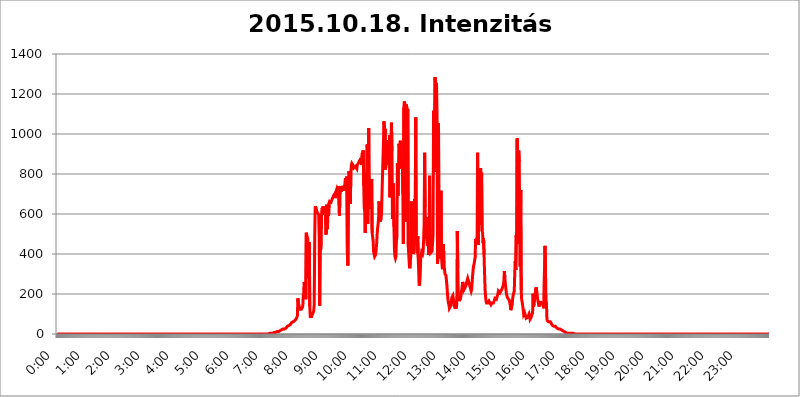
| Category | 2015.10.18. Intenzitás [W/m^2] |
|---|---|
| 0.0 | 0 |
| 0.0006944444444444445 | 0 |
| 0.001388888888888889 | 0 |
| 0.0020833333333333333 | 0 |
| 0.002777777777777778 | 0 |
| 0.003472222222222222 | 0 |
| 0.004166666666666667 | 0 |
| 0.004861111111111111 | 0 |
| 0.005555555555555556 | 0 |
| 0.0062499999999999995 | 0 |
| 0.006944444444444444 | 0 |
| 0.007638888888888889 | 0 |
| 0.008333333333333333 | 0 |
| 0.009027777777777779 | 0 |
| 0.009722222222222222 | 0 |
| 0.010416666666666666 | 0 |
| 0.011111111111111112 | 0 |
| 0.011805555555555555 | 0 |
| 0.012499999999999999 | 0 |
| 0.013194444444444444 | 0 |
| 0.013888888888888888 | 0 |
| 0.014583333333333332 | 0 |
| 0.015277777777777777 | 0 |
| 0.015972222222222224 | 0 |
| 0.016666666666666666 | 0 |
| 0.017361111111111112 | 0 |
| 0.018055555555555557 | 0 |
| 0.01875 | 0 |
| 0.019444444444444445 | 0 |
| 0.02013888888888889 | 0 |
| 0.020833333333333332 | 0 |
| 0.02152777777777778 | 0 |
| 0.022222222222222223 | 0 |
| 0.02291666666666667 | 0 |
| 0.02361111111111111 | 0 |
| 0.024305555555555556 | 0 |
| 0.024999999999999998 | 0 |
| 0.025694444444444447 | 0 |
| 0.02638888888888889 | 0 |
| 0.027083333333333334 | 0 |
| 0.027777777777777776 | 0 |
| 0.02847222222222222 | 0 |
| 0.029166666666666664 | 0 |
| 0.029861111111111113 | 0 |
| 0.030555555555555555 | 0 |
| 0.03125 | 0 |
| 0.03194444444444445 | 0 |
| 0.03263888888888889 | 0 |
| 0.03333333333333333 | 0 |
| 0.034027777777777775 | 0 |
| 0.034722222222222224 | 0 |
| 0.035416666666666666 | 0 |
| 0.036111111111111115 | 0 |
| 0.03680555555555556 | 0 |
| 0.0375 | 0 |
| 0.03819444444444444 | 0 |
| 0.03888888888888889 | 0 |
| 0.03958333333333333 | 0 |
| 0.04027777777777778 | 0 |
| 0.04097222222222222 | 0 |
| 0.041666666666666664 | 0 |
| 0.042361111111111106 | 0 |
| 0.04305555555555556 | 0 |
| 0.043750000000000004 | 0 |
| 0.044444444444444446 | 0 |
| 0.04513888888888889 | 0 |
| 0.04583333333333334 | 0 |
| 0.04652777777777778 | 0 |
| 0.04722222222222222 | 0 |
| 0.04791666666666666 | 0 |
| 0.04861111111111111 | 0 |
| 0.049305555555555554 | 0 |
| 0.049999999999999996 | 0 |
| 0.05069444444444445 | 0 |
| 0.051388888888888894 | 0 |
| 0.052083333333333336 | 0 |
| 0.05277777777777778 | 0 |
| 0.05347222222222222 | 0 |
| 0.05416666666666667 | 0 |
| 0.05486111111111111 | 0 |
| 0.05555555555555555 | 0 |
| 0.05625 | 0 |
| 0.05694444444444444 | 0 |
| 0.057638888888888885 | 0 |
| 0.05833333333333333 | 0 |
| 0.05902777777777778 | 0 |
| 0.059722222222222225 | 0 |
| 0.06041666666666667 | 0 |
| 0.061111111111111116 | 0 |
| 0.06180555555555556 | 0 |
| 0.0625 | 0 |
| 0.06319444444444444 | 0 |
| 0.06388888888888888 | 0 |
| 0.06458333333333334 | 0 |
| 0.06527777777777778 | 0 |
| 0.06597222222222222 | 0 |
| 0.06666666666666667 | 0 |
| 0.06736111111111111 | 0 |
| 0.06805555555555555 | 0 |
| 0.06874999999999999 | 0 |
| 0.06944444444444443 | 0 |
| 0.07013888888888889 | 0 |
| 0.07083333333333333 | 0 |
| 0.07152777777777779 | 0 |
| 0.07222222222222223 | 0 |
| 0.07291666666666667 | 0 |
| 0.07361111111111111 | 0 |
| 0.07430555555555556 | 0 |
| 0.075 | 0 |
| 0.07569444444444444 | 0 |
| 0.0763888888888889 | 0 |
| 0.07708333333333334 | 0 |
| 0.07777777777777778 | 0 |
| 0.07847222222222222 | 0 |
| 0.07916666666666666 | 0 |
| 0.0798611111111111 | 0 |
| 0.08055555555555556 | 0 |
| 0.08125 | 0 |
| 0.08194444444444444 | 0 |
| 0.08263888888888889 | 0 |
| 0.08333333333333333 | 0 |
| 0.08402777777777777 | 0 |
| 0.08472222222222221 | 0 |
| 0.08541666666666665 | 0 |
| 0.08611111111111112 | 0 |
| 0.08680555555555557 | 0 |
| 0.08750000000000001 | 0 |
| 0.08819444444444445 | 0 |
| 0.08888888888888889 | 0 |
| 0.08958333333333333 | 0 |
| 0.09027777777777778 | 0 |
| 0.09097222222222222 | 0 |
| 0.09166666666666667 | 0 |
| 0.09236111111111112 | 0 |
| 0.09305555555555556 | 0 |
| 0.09375 | 0 |
| 0.09444444444444444 | 0 |
| 0.09513888888888888 | 0 |
| 0.09583333333333333 | 0 |
| 0.09652777777777777 | 0 |
| 0.09722222222222222 | 0 |
| 0.09791666666666667 | 0 |
| 0.09861111111111111 | 0 |
| 0.09930555555555555 | 0 |
| 0.09999999999999999 | 0 |
| 0.10069444444444443 | 0 |
| 0.1013888888888889 | 0 |
| 0.10208333333333335 | 0 |
| 0.10277777777777779 | 0 |
| 0.10347222222222223 | 0 |
| 0.10416666666666667 | 0 |
| 0.10486111111111111 | 0 |
| 0.10555555555555556 | 0 |
| 0.10625 | 0 |
| 0.10694444444444444 | 0 |
| 0.1076388888888889 | 0 |
| 0.10833333333333334 | 0 |
| 0.10902777777777778 | 0 |
| 0.10972222222222222 | 0 |
| 0.1111111111111111 | 0 |
| 0.11180555555555556 | 0 |
| 0.11180555555555556 | 0 |
| 0.1125 | 0 |
| 0.11319444444444444 | 0 |
| 0.11388888888888889 | 0 |
| 0.11458333333333333 | 0 |
| 0.11527777777777777 | 0 |
| 0.11597222222222221 | 0 |
| 0.11666666666666665 | 0 |
| 0.1173611111111111 | 0 |
| 0.11805555555555557 | 0 |
| 0.11944444444444445 | 0 |
| 0.12013888888888889 | 0 |
| 0.12083333333333333 | 0 |
| 0.12152777777777778 | 0 |
| 0.12222222222222223 | 0 |
| 0.12291666666666667 | 0 |
| 0.12291666666666667 | 0 |
| 0.12361111111111112 | 0 |
| 0.12430555555555556 | 0 |
| 0.125 | 0 |
| 0.12569444444444444 | 0 |
| 0.12638888888888888 | 0 |
| 0.12708333333333333 | 0 |
| 0.16875 | 0 |
| 0.12847222222222224 | 0 |
| 0.12916666666666668 | 0 |
| 0.12986111111111112 | 0 |
| 0.13055555555555556 | 0 |
| 0.13125 | 0 |
| 0.13194444444444445 | 0 |
| 0.1326388888888889 | 0 |
| 0.13333333333333333 | 0 |
| 0.13402777777777777 | 0 |
| 0.13402777777777777 | 0 |
| 0.13472222222222222 | 0 |
| 0.13541666666666666 | 0 |
| 0.1361111111111111 | 0 |
| 0.13749999999999998 | 0 |
| 0.13819444444444443 | 0 |
| 0.1388888888888889 | 0 |
| 0.13958333333333334 | 0 |
| 0.14027777777777778 | 0 |
| 0.14097222222222222 | 0 |
| 0.14166666666666666 | 0 |
| 0.1423611111111111 | 0 |
| 0.14305555555555557 | 0 |
| 0.14375000000000002 | 0 |
| 0.14444444444444446 | 0 |
| 0.1451388888888889 | 0 |
| 0.1451388888888889 | 0 |
| 0.14652777777777778 | 0 |
| 0.14722222222222223 | 0 |
| 0.14791666666666667 | 0 |
| 0.1486111111111111 | 0 |
| 0.14930555555555555 | 0 |
| 0.15 | 0 |
| 0.15069444444444444 | 0 |
| 0.15138888888888888 | 0 |
| 0.15208333333333332 | 0 |
| 0.15277777777777776 | 0 |
| 0.15347222222222223 | 0 |
| 0.15416666666666667 | 0 |
| 0.15486111111111112 | 0 |
| 0.15555555555555556 | 0 |
| 0.15625 | 0 |
| 0.15694444444444444 | 0 |
| 0.15763888888888888 | 0 |
| 0.15833333333333333 | 0 |
| 0.15902777777777777 | 0 |
| 0.15972222222222224 | 0 |
| 0.16041666666666668 | 0 |
| 0.16111111111111112 | 0 |
| 0.16180555555555556 | 0 |
| 0.1625 | 0 |
| 0.16319444444444445 | 0 |
| 0.1638888888888889 | 0 |
| 0.16458333333333333 | 0 |
| 0.16527777777777777 | 0 |
| 0.16597222222222222 | 0 |
| 0.16666666666666666 | 0 |
| 0.1673611111111111 | 0 |
| 0.16805555555555554 | 0 |
| 0.16874999999999998 | 0 |
| 0.16944444444444443 | 0 |
| 0.17013888888888887 | 0 |
| 0.1708333333333333 | 0 |
| 0.17152777777777775 | 0 |
| 0.17222222222222225 | 0 |
| 0.1729166666666667 | 0 |
| 0.17361111111111113 | 0 |
| 0.17430555555555557 | 0 |
| 0.17500000000000002 | 0 |
| 0.17569444444444446 | 0 |
| 0.1763888888888889 | 0 |
| 0.17708333333333334 | 0 |
| 0.17777777777777778 | 0 |
| 0.17847222222222223 | 0 |
| 0.17916666666666667 | 0 |
| 0.1798611111111111 | 0 |
| 0.18055555555555555 | 0 |
| 0.18125 | 0 |
| 0.18194444444444444 | 0 |
| 0.1826388888888889 | 0 |
| 0.18333333333333335 | 0 |
| 0.1840277777777778 | 0 |
| 0.18472222222222223 | 0 |
| 0.18541666666666667 | 0 |
| 0.18611111111111112 | 0 |
| 0.18680555555555556 | 0 |
| 0.1875 | 0 |
| 0.18819444444444444 | 0 |
| 0.18888888888888888 | 0 |
| 0.18958333333333333 | 0 |
| 0.19027777777777777 | 0 |
| 0.1909722222222222 | 0 |
| 0.19166666666666665 | 0 |
| 0.19236111111111112 | 0 |
| 0.19305555555555554 | 0 |
| 0.19375 | 0 |
| 0.19444444444444445 | 0 |
| 0.1951388888888889 | 0 |
| 0.19583333333333333 | 0 |
| 0.19652777777777777 | 0 |
| 0.19722222222222222 | 0 |
| 0.19791666666666666 | 0 |
| 0.1986111111111111 | 0 |
| 0.19930555555555554 | 0 |
| 0.19999999999999998 | 0 |
| 0.20069444444444443 | 0 |
| 0.20138888888888887 | 0 |
| 0.2020833333333333 | 0 |
| 0.2027777777777778 | 0 |
| 0.2034722222222222 | 0 |
| 0.2041666666666667 | 0 |
| 0.20486111111111113 | 0 |
| 0.20555555555555557 | 0 |
| 0.20625000000000002 | 0 |
| 0.20694444444444446 | 0 |
| 0.2076388888888889 | 0 |
| 0.20833333333333334 | 0 |
| 0.20902777777777778 | 0 |
| 0.20972222222222223 | 0 |
| 0.21041666666666667 | 0 |
| 0.2111111111111111 | 0 |
| 0.21180555555555555 | 0 |
| 0.2125 | 0 |
| 0.21319444444444444 | 0 |
| 0.2138888888888889 | 0 |
| 0.21458333333333335 | 0 |
| 0.2152777777777778 | 0 |
| 0.21597222222222223 | 0 |
| 0.21666666666666667 | 0 |
| 0.21736111111111112 | 0 |
| 0.21805555555555556 | 0 |
| 0.21875 | 0 |
| 0.21944444444444444 | 0 |
| 0.22013888888888888 | 0 |
| 0.22083333333333333 | 0 |
| 0.22152777777777777 | 0 |
| 0.2222222222222222 | 0 |
| 0.22291666666666665 | 0 |
| 0.2236111111111111 | 0 |
| 0.22430555555555556 | 0 |
| 0.225 | 0 |
| 0.22569444444444445 | 0 |
| 0.2263888888888889 | 0 |
| 0.22708333333333333 | 0 |
| 0.22777777777777777 | 0 |
| 0.22847222222222222 | 0 |
| 0.22916666666666666 | 0 |
| 0.2298611111111111 | 0 |
| 0.23055555555555554 | 0 |
| 0.23124999999999998 | 0 |
| 0.23194444444444443 | 0 |
| 0.23263888888888887 | 0 |
| 0.2333333333333333 | 0 |
| 0.2340277777777778 | 0 |
| 0.2347222222222222 | 0 |
| 0.2354166666666667 | 0 |
| 0.23611111111111113 | 0 |
| 0.23680555555555557 | 0 |
| 0.23750000000000002 | 0 |
| 0.23819444444444446 | 0 |
| 0.2388888888888889 | 0 |
| 0.23958333333333334 | 0 |
| 0.24027777777777778 | 0 |
| 0.24097222222222223 | 0 |
| 0.24166666666666667 | 0 |
| 0.2423611111111111 | 0 |
| 0.24305555555555555 | 0 |
| 0.24375 | 0 |
| 0.24444444444444446 | 0 |
| 0.24513888888888888 | 0 |
| 0.24583333333333335 | 0 |
| 0.2465277777777778 | 0 |
| 0.24722222222222223 | 0 |
| 0.24791666666666667 | 0 |
| 0.24861111111111112 | 0 |
| 0.24930555555555556 | 0 |
| 0.25 | 0 |
| 0.25069444444444444 | 0 |
| 0.2513888888888889 | 0 |
| 0.2520833333333333 | 0 |
| 0.25277777777777777 | 0 |
| 0.2534722222222222 | 0 |
| 0.25416666666666665 | 0 |
| 0.2548611111111111 | 0 |
| 0.2555555555555556 | 0 |
| 0.25625000000000003 | 0 |
| 0.2569444444444445 | 0 |
| 0.2576388888888889 | 0 |
| 0.25833333333333336 | 0 |
| 0.2590277777777778 | 0 |
| 0.25972222222222224 | 0 |
| 0.2604166666666667 | 0 |
| 0.2611111111111111 | 0 |
| 0.26180555555555557 | 0 |
| 0.2625 | 0 |
| 0.26319444444444445 | 0 |
| 0.2638888888888889 | 0 |
| 0.26458333333333334 | 0 |
| 0.2652777777777778 | 0 |
| 0.2659722222222222 | 0 |
| 0.26666666666666666 | 0 |
| 0.2673611111111111 | 0 |
| 0.26805555555555555 | 0 |
| 0.26875 | 0 |
| 0.26944444444444443 | 0 |
| 0.2701388888888889 | 0 |
| 0.2708333333333333 | 0 |
| 0.27152777777777776 | 0 |
| 0.2722222222222222 | 0 |
| 0.27291666666666664 | 0 |
| 0.2736111111111111 | 0 |
| 0.2743055555555555 | 0 |
| 0.27499999999999997 | 0 |
| 0.27569444444444446 | 0 |
| 0.27638888888888885 | 0 |
| 0.27708333333333335 | 0 |
| 0.2777777777777778 | 0 |
| 0.27847222222222223 | 0 |
| 0.2791666666666667 | 0 |
| 0.2798611111111111 | 0 |
| 0.28055555555555556 | 0 |
| 0.28125 | 0 |
| 0.28194444444444444 | 0 |
| 0.2826388888888889 | 0 |
| 0.2833333333333333 | 0 |
| 0.28402777777777777 | 0 |
| 0.2847222222222222 | 0 |
| 0.28541666666666665 | 0 |
| 0.28611111111111115 | 0 |
| 0.28680555555555554 | 0 |
| 0.28750000000000003 | 0 |
| 0.2881944444444445 | 0 |
| 0.2888888888888889 | 0 |
| 0.28958333333333336 | 0 |
| 0.2902777777777778 | 0 |
| 0.29097222222222224 | 0 |
| 0.2916666666666667 | 0 |
| 0.2923611111111111 | 0 |
| 0.29305555555555557 | 0 |
| 0.29375 | 0 |
| 0.29444444444444445 | 0 |
| 0.2951388888888889 | 0 |
| 0.29583333333333334 | 0 |
| 0.2965277777777778 | 0 |
| 0.2972222222222222 | 0 |
| 0.29791666666666666 | 3.525 |
| 0.2986111111111111 | 3.525 |
| 0.29930555555555555 | 3.525 |
| 0.3 | 3.525 |
| 0.30069444444444443 | 3.525 |
| 0.3013888888888889 | 3.525 |
| 0.3020833333333333 | 3.525 |
| 0.30277777777777776 | 3.525 |
| 0.3034722222222222 | 3.525 |
| 0.30416666666666664 | 7.887 |
| 0.3048611111111111 | 7.887 |
| 0.3055555555555555 | 7.887 |
| 0.30624999999999997 | 7.887 |
| 0.3069444444444444 | 7.887 |
| 0.3076388888888889 | 7.887 |
| 0.30833333333333335 | 12.257 |
| 0.3090277777777778 | 12.257 |
| 0.30972222222222223 | 12.257 |
| 0.3104166666666667 | 12.257 |
| 0.3111111111111111 | 12.257 |
| 0.31180555555555556 | 16.636 |
| 0.3125 | 16.636 |
| 0.31319444444444444 | 16.636 |
| 0.3138888888888889 | 16.636 |
| 0.3145833333333333 | 21.024 |
| 0.31527777777777777 | 21.024 |
| 0.3159722222222222 | 21.024 |
| 0.31666666666666665 | 25.419 |
| 0.31736111111111115 | 25.419 |
| 0.31805555555555554 | 25.419 |
| 0.31875000000000003 | 25.419 |
| 0.3194444444444445 | 29.823 |
| 0.3201388888888889 | 29.823 |
| 0.32083333333333336 | 29.823 |
| 0.3215277777777778 | 34.234 |
| 0.32222222222222224 | 34.234 |
| 0.3229166666666667 | 38.653 |
| 0.3236111111111111 | 38.653 |
| 0.32430555555555557 | 43.079 |
| 0.325 | 43.079 |
| 0.32569444444444445 | 47.511 |
| 0.3263888888888889 | 47.511 |
| 0.32708333333333334 | 47.511 |
| 0.3277777777777778 | 51.951 |
| 0.3284722222222222 | 56.398 |
| 0.32916666666666666 | 56.398 |
| 0.3298611111111111 | 56.398 |
| 0.33055555555555555 | 60.85 |
| 0.33125 | 60.85 |
| 0.33194444444444443 | 60.85 |
| 0.3326388888888889 | 65.31 |
| 0.3333333333333333 | 65.31 |
| 0.3340277777777778 | 69.775 |
| 0.3347222222222222 | 74.246 |
| 0.3354166666666667 | 78.722 |
| 0.3361111111111111 | 83.205 |
| 0.3368055555555556 | 92.184 |
| 0.33749999999999997 | 178.264 |
| 0.33819444444444446 | 155.509 |
| 0.33888888888888885 | 160.056 |
| 0.33958333333333335 | 150.964 |
| 0.34027777777777773 | 123.758 |
| 0.34097222222222223 | 119.235 |
| 0.3416666666666666 | 123.758 |
| 0.3423611111111111 | 123.758 |
| 0.3430555555555555 | 128.284 |
| 0.34375 | 132.814 |
| 0.3444444444444445 | 141.884 |
| 0.3451388888888889 | 201.058 |
| 0.3458333333333334 | 191.937 |
| 0.34652777777777777 | 260.373 |
| 0.34722222222222227 | 242.127 |
| 0.34791666666666665 | 219.309 |
| 0.34861111111111115 | 173.709 |
| 0.34930555555555554 | 506.542 |
| 0.35000000000000003 | 493.475 |
| 0.3506944444444444 | 493.475 |
| 0.3513888888888889 | 475.972 |
| 0.3520833333333333 | 278.603 |
| 0.3527777777777778 | 378.224 |
| 0.3534722222222222 | 458.38 |
| 0.3541666666666667 | 137.347 |
| 0.3548611111111111 | 87.692 |
| 0.35555555555555557 | 83.205 |
| 0.35625 | 83.205 |
| 0.35694444444444445 | 87.692 |
| 0.3576388888888889 | 96.682 |
| 0.35833333333333334 | 96.682 |
| 0.3590277777777778 | 101.184 |
| 0.3597222222222222 | 114.716 |
| 0.36041666666666666 | 146.423 |
| 0.3611111111111111 | 484.735 |
| 0.36180555555555555 | 638.256 |
| 0.3625 | 634.105 |
| 0.36319444444444443 | 625.784 |
| 0.3638888888888889 | 621.613 |
| 0.3645833333333333 | 609.062 |
| 0.3652777777777778 | 609.062 |
| 0.3659722222222222 | 604.864 |
| 0.3666666666666667 | 596.45 |
| 0.3673611111111111 | 489.108 |
| 0.3680555555555556 | 141.884 |
| 0.36874999999999997 | 445.129 |
| 0.36944444444444446 | 422.943 |
| 0.37013888888888885 | 458.38 |
| 0.37083333333333335 | 609.062 |
| 0.37152777777777773 | 629.948 |
| 0.37222222222222223 | 621.613 |
| 0.3729166666666666 | 638.256 |
| 0.3736111111111111 | 617.436 |
| 0.3743055555555555 | 604.864 |
| 0.375 | 617.436 |
| 0.3756944444444445 | 596.45 |
| 0.3763888888888889 | 621.613 |
| 0.3770833333333334 | 497.836 |
| 0.37777777777777777 | 646.537 |
| 0.37847222222222227 | 523.88 |
| 0.37916666666666665 | 549.704 |
| 0.37986111111111115 | 625.784 |
| 0.38055555555555554 | 592.233 |
| 0.38125000000000003 | 654.791 |
| 0.3819444444444444 | 663.019 |
| 0.3826388888888889 | 667.123 |
| 0.3833333333333333 | 658.909 |
| 0.3840277777777778 | 658.909 |
| 0.3847222222222222 | 667.123 |
| 0.3854166666666667 | 671.22 |
| 0.3861111111111111 | 679.395 |
| 0.38680555555555557 | 683.473 |
| 0.3875 | 691.608 |
| 0.38819444444444445 | 691.608 |
| 0.3888888888888889 | 695.666 |
| 0.38958333333333334 | 703.762 |
| 0.3902777777777778 | 679.395 |
| 0.3909722222222222 | 703.762 |
| 0.39166666666666666 | 719.877 |
| 0.3923611111111111 | 727.896 |
| 0.39305555555555555 | 727.896 |
| 0.39375 | 715.858 |
| 0.39444444444444443 | 739.877 |
| 0.3951388888888889 | 743.859 |
| 0.3958333333333333 | 592.233 |
| 0.3965277777777778 | 723.889 |
| 0.3972222222222222 | 739.877 |
| 0.3979166666666667 | 727.896 |
| 0.3986111111111111 | 711.832 |
| 0.3993055555555556 | 739.877 |
| 0.39999999999999997 | 735.89 |
| 0.40069444444444446 | 739.877 |
| 0.40138888888888885 | 723.889 |
| 0.40208333333333335 | 715.858 |
| 0.40277777777777773 | 735.89 |
| 0.40347222222222223 | 751.803 |
| 0.4041666666666666 | 779.42 |
| 0.4048611111111111 | 723.889 |
| 0.4055555555555555 | 767.62 |
| 0.40625 | 787.258 |
| 0.4069444444444445 | 405.108 |
| 0.4076388888888889 | 342.162 |
| 0.4083333333333334 | 691.608 |
| 0.40902777777777777 | 814.519 |
| 0.40972222222222227 | 810.641 |
| 0.41041666666666665 | 787.258 |
| 0.41111111111111115 | 650.667 |
| 0.41180555555555554 | 814.519 |
| 0.41250000000000003 | 841.526 |
| 0.4131944444444444 | 853.029 |
| 0.4138888888888889 | 853.029 |
| 0.4145833333333333 | 845.365 |
| 0.4152777777777778 | 837.682 |
| 0.4159722222222222 | 829.981 |
| 0.4166666666666667 | 829.981 |
| 0.4173611111111111 | 833.834 |
| 0.41805555555555557 | 837.682 |
| 0.41875 | 837.682 |
| 0.41944444444444445 | 841.526 |
| 0.4201388888888889 | 826.123 |
| 0.42083333333333334 | 845.365 |
| 0.4215277777777778 | 849.199 |
| 0.4222222222222222 | 853.029 |
| 0.42291666666666666 | 856.855 |
| 0.4236111111111111 | 864.493 |
| 0.42430555555555555 | 868.305 |
| 0.425 | 872.114 |
| 0.42569444444444443 | 879.719 |
| 0.4263888888888889 | 883.516 |
| 0.4270833333333333 | 845.365 |
| 0.4277777777777778 | 906.223 |
| 0.4284722222222222 | 898.668 |
| 0.4291666666666667 | 917.534 |
| 0.4298611111111111 | 743.859 |
| 0.4305555555555556 | 629.948 |
| 0.43124999999999997 | 613.252 |
| 0.43194444444444446 | 506.542 |
| 0.43263888888888885 | 699.717 |
| 0.43333333333333335 | 798.974 |
| 0.43402777777777773 | 806.757 |
| 0.43472222222222223 | 947.58 |
| 0.4354166666666666 | 549.704 |
| 0.4361111111111111 | 723.889 |
| 0.4368055555555555 | 1029.798 |
| 0.4375 | 625.784 |
| 0.4381944444444445 | 723.889 |
| 0.4388888888888889 | 735.89 |
| 0.4395833333333334 | 759.723 |
| 0.44027777777777777 | 731.896 |
| 0.44097222222222227 | 775.492 |
| 0.44166666666666665 | 506.542 |
| 0.44236111111111115 | 484.735 |
| 0.44305555555555554 | 462.786 |
| 0.44375000000000003 | 409.574 |
| 0.4444444444444444 | 405.108 |
| 0.4451388888888889 | 387.202 |
| 0.4458333333333333 | 387.202 |
| 0.4465277777777778 | 396.164 |
| 0.4472222222222222 | 418.492 |
| 0.4479166666666667 | 449.551 |
| 0.4486111111111111 | 497.836 |
| 0.44930555555555557 | 528.2 |
| 0.45 | 549.704 |
| 0.45069444444444445 | 579.542 |
| 0.4513888888888889 | 663.019 |
| 0.45208333333333334 | 583.779 |
| 0.4527777777777778 | 562.53 |
| 0.4534722222222222 | 566.793 |
| 0.45416666666666666 | 575.299 |
| 0.4548611111111111 | 609.062 |
| 0.45555555555555555 | 711.832 |
| 0.45625 | 711.832 |
| 0.45694444444444443 | 891.099 |
| 0.4576388888888889 | 973.772 |
| 0.4583333333333333 | 1063.51 |
| 0.4590277777777778 | 962.555 |
| 0.4597222222222222 | 1026.06 |
| 0.4604166666666667 | 822.26 |
| 0.4611111111111111 | 818.392 |
| 0.4618055555555556 | 887.309 |
| 0.46249999999999997 | 970.034 |
| 0.46319444444444446 | 940.082 |
| 0.46388888888888885 | 883.516 |
| 0.46458333333333335 | 883.516 |
| 0.46527777777777773 | 845.365 |
| 0.46597222222222223 | 992.448 |
| 0.4666666666666666 | 683.473 |
| 0.4673611111111111 | 751.803 |
| 0.4680555555555555 | 723.889 |
| 0.46875 | 1056.004 |
| 0.4694444444444445 | 913.766 |
| 0.4701388888888889 | 575.299 |
| 0.4708333333333334 | 575.299 |
| 0.47152777777777777 | 751.803 |
| 0.47222222222222227 | 536.82 |
| 0.47291666666666665 | 422.943 |
| 0.47361111111111115 | 387.202 |
| 0.47430555555555554 | 378.224 |
| 0.47500000000000003 | 387.202 |
| 0.4756944444444444 | 467.187 |
| 0.4763888888888889 | 484.735 |
| 0.4770833333333333 | 853.029 |
| 0.4777777777777778 | 691.608 |
| 0.4784722222222222 | 791.169 |
| 0.4791666666666667 | 951.327 |
| 0.4798611111111111 | 932.576 |
| 0.48055555555555557 | 902.447 |
| 0.48125 | 966.295 |
| 0.48194444444444445 | 925.06 |
| 0.4826388888888889 | 826.123 |
| 0.48333333333333334 | 853.029 |
| 0.4840277777777778 | 872.114 |
| 0.4847222222222222 | 699.717 |
| 0.48541666666666666 | 449.551 |
| 0.4861111111111111 | 1131.708 |
| 0.48680555555555555 | 1162.571 |
| 0.4875 | 1150.946 |
| 0.48819444444444443 | 1093.653 |
| 0.4888888888888889 | 562.53 |
| 0.4895833333333333 | 1147.086 |
| 0.4902777777777778 | 1150.946 |
| 0.4909722222222222 | 1112.618 |
| 0.4916666666666667 | 1124.056 |
| 0.4923611111111111 | 436.27 |
| 0.4930555555555556 | 391.685 |
| 0.49374999999999997 | 346.682 |
| 0.49444444444444446 | 328.584 |
| 0.49513888888888885 | 360.221 |
| 0.49583333333333335 | 387.202 |
| 0.49652777777777773 | 663.019 |
| 0.49722222222222223 | 541.121 |
| 0.4979166666666666 | 506.542 |
| 0.4986111111111111 | 440.702 |
| 0.4993055555555555 | 400.638 |
| 0.5 | 409.574 |
| 0.5006944444444444 | 458.38 |
| 0.5013888888888889 | 675.311 |
| 0.5020833333333333 | 588.009 |
| 0.5027777777777778 | 1082.324 |
| 0.5034722222222222 | 493.475 |
| 0.5041666666666667 | 436.27 |
| 0.5048611111111111 | 405.108 |
| 0.5055555555555555 | 489.108 |
| 0.50625 | 382.715 |
| 0.5069444444444444 | 310.44 |
| 0.5076388888888889 | 242.127 |
| 0.5083333333333333 | 251.251 |
| 0.5090277777777777 | 292.259 |
| 0.5097222222222222 | 373.729 |
| 0.5104166666666666 | 369.23 |
| 0.5111111111111112 | 409.574 |
| 0.5118055555555555 | 405.108 |
| 0.5125000000000001 | 400.638 |
| 0.5131944444444444 | 414.035 |
| 0.513888888888889 | 475.972 |
| 0.5145833333333333 | 553.986 |
| 0.5152777777777778 | 906.223 |
| 0.5159722222222222 | 634.105 |
| 0.5166666666666667 | 480.356 |
| 0.517361111111111 | 583.779 |
| 0.5180555555555556 | 475.972 |
| 0.5187499999999999 | 453.968 |
| 0.5194444444444445 | 440.702 |
| 0.5201388888888888 | 489.108 |
| 0.5208333333333334 | 396.164 |
| 0.5215277777777778 | 431.833 |
| 0.5222222222222223 | 791.169 |
| 0.5229166666666667 | 431.833 |
| 0.5236111111111111 | 405.108 |
| 0.5243055555555556 | 405.108 |
| 0.525 | 405.108 |
| 0.5256944444444445 | 414.035 |
| 0.5263888888888889 | 453.968 |
| 0.5270833333333333 | 497.836 |
| 0.5277777777777778 | 1116.426 |
| 0.5284722222222222 | 917.534 |
| 0.5291666666666667 | 810.641 |
| 0.5298611111111111 | 1283.541 |
| 0.5305555555555556 | 1258.511 |
| 0.53125 | 1262.649 |
| 0.5319444444444444 | 1250.275 |
| 0.5326388888888889 | 1101.226 |
| 0.5333333333333333 | 351.198 |
| 0.5340277777777778 | 405.108 |
| 0.5347222222222222 | 1052.255 |
| 0.5354166666666667 | 387.202 |
| 0.5361111111111111 | 378.224 |
| 0.5368055555555555 | 449.551 |
| 0.5375 | 458.38 |
| 0.5381944444444444 | 715.858 |
| 0.5388888888888889 | 387.202 |
| 0.5395833333333333 | 351.198 |
| 0.5402777777777777 | 324.052 |
| 0.5409722222222222 | 400.638 |
| 0.5416666666666666 | 449.551 |
| 0.5423611111111112 | 351.198 |
| 0.5430555555555555 | 346.682 |
| 0.5437500000000001 | 301.354 |
| 0.5444444444444444 | 296.808 |
| 0.545138888888889 | 292.259 |
| 0.5458333333333333 | 269.49 |
| 0.5465277777777778 | 242.127 |
| 0.5472222222222222 | 205.62 |
| 0.5479166666666667 | 173.709 |
| 0.548611111111111 | 155.509 |
| 0.5493055555555556 | 146.423 |
| 0.5499999999999999 | 128.284 |
| 0.5506944444444445 | 123.758 |
| 0.5513888888888888 | 128.284 |
| 0.5520833333333334 | 141.884 |
| 0.5527777777777778 | 164.605 |
| 0.5534722222222223 | 182.82 |
| 0.5541666666666667 | 187.378 |
| 0.5548611111111111 | 191.937 |
| 0.5555555555555556 | 187.378 |
| 0.55625 | 160.056 |
| 0.5569444444444445 | 141.884 |
| 0.5576388888888889 | 132.814 |
| 0.5583333333333333 | 128.284 |
| 0.5590277777777778 | 128.284 |
| 0.5597222222222222 | 132.814 |
| 0.5604166666666667 | 150.964 |
| 0.5611111111111111 | 515.223 |
| 0.5618055555555556 | 328.584 |
| 0.5625 | 191.937 |
| 0.5631944444444444 | 182.82 |
| 0.5638888888888889 | 164.605 |
| 0.5645833333333333 | 169.156 |
| 0.5652777777777778 | 169.156 |
| 0.5659722222222222 | 182.82 |
| 0.5666666666666667 | 210.182 |
| 0.5673611111111111 | 219.309 |
| 0.5680555555555555 | 242.127 |
| 0.56875 | 260.373 |
| 0.5694444444444444 | 242.127 |
| 0.5701388888888889 | 219.309 |
| 0.5708333333333333 | 219.309 |
| 0.5715277777777777 | 228.436 |
| 0.5722222222222222 | 228.436 |
| 0.5729166666666666 | 233 |
| 0.5736111111111112 | 246.689 |
| 0.5743055555555555 | 260.373 |
| 0.5750000000000001 | 269.49 |
| 0.5756944444444444 | 278.603 |
| 0.576388888888889 | 278.603 |
| 0.5770833333333333 | 278.603 |
| 0.5777777777777778 | 251.251 |
| 0.5784722222222222 | 246.689 |
| 0.5791666666666667 | 233 |
| 0.579861111111111 | 223.873 |
| 0.5805555555555556 | 214.746 |
| 0.5812499999999999 | 223.873 |
| 0.5819444444444445 | 260.373 |
| 0.5826388888888888 | 296.808 |
| 0.5833333333333334 | 324.052 |
| 0.5840277777777778 | 342.162 |
| 0.5847222222222223 | 351.198 |
| 0.5854166666666667 | 369.23 |
| 0.5861111111111111 | 382.715 |
| 0.5868055555555556 | 475.972 |
| 0.5875 | 453.968 |
| 0.5881944444444445 | 467.187 |
| 0.5888888888888889 | 489.108 |
| 0.5895833333333333 | 906.223 |
| 0.5902777777777778 | 445.129 |
| 0.5909722222222222 | 613.252 |
| 0.5916666666666667 | 596.45 |
| 0.5923611111111111 | 566.793 |
| 0.5930555555555556 | 545.416 |
| 0.59375 | 829.981 |
| 0.5944444444444444 | 629.948 |
| 0.5951388888888889 | 806.757 |
| 0.5958333333333333 | 515.223 |
| 0.5965277777777778 | 506.542 |
| 0.5972222222222222 | 453.968 |
| 0.5979166666666667 | 480.356 |
| 0.5986111111111111 | 396.164 |
| 0.5993055555555555 | 305.898 |
| 0.6 | 223.873 |
| 0.6006944444444444 | 187.378 |
| 0.6013888888888889 | 164.605 |
| 0.6020833333333333 | 155.509 |
| 0.6027777777777777 | 155.509 |
| 0.6034722222222222 | 155.509 |
| 0.6041666666666666 | 155.509 |
| 0.6048611111111112 | 160.056 |
| 0.6055555555555555 | 164.605 |
| 0.6062500000000001 | 160.056 |
| 0.6069444444444444 | 155.509 |
| 0.607638888888889 | 155.509 |
| 0.6083333333333333 | 146.423 |
| 0.6090277777777778 | 141.884 |
| 0.6097222222222222 | 155.509 |
| 0.6104166666666667 | 150.964 |
| 0.611111111111111 | 155.509 |
| 0.6118055555555556 | 155.509 |
| 0.6124999999999999 | 160.056 |
| 0.6131944444444445 | 169.156 |
| 0.6138888888888888 | 178.264 |
| 0.6145833333333334 | 182.82 |
| 0.6152777777777778 | 178.264 |
| 0.6159722222222223 | 173.709 |
| 0.6166666666666667 | 182.82 |
| 0.6173611111111111 | 187.378 |
| 0.6180555555555556 | 201.058 |
| 0.61875 | 214.746 |
| 0.6194444444444445 | 219.309 |
| 0.6201388888888889 | 210.182 |
| 0.6208333333333333 | 205.62 |
| 0.6215277777777778 | 205.62 |
| 0.6222222222222222 | 214.746 |
| 0.6229166666666667 | 219.309 |
| 0.6236111111111111 | 223.873 |
| 0.6243055555555556 | 228.436 |
| 0.625 | 237.564 |
| 0.6256944444444444 | 246.689 |
| 0.6263888888888889 | 264.932 |
| 0.6270833333333333 | 314.98 |
| 0.6277777777777778 | 278.603 |
| 0.6284722222222222 | 251.251 |
| 0.6291666666666667 | 228.436 |
| 0.6298611111111111 | 205.62 |
| 0.6305555555555555 | 191.937 |
| 0.63125 | 191.937 |
| 0.6319444444444444 | 178.264 |
| 0.6326388888888889 | 182.82 |
| 0.6333333333333333 | 178.264 |
| 0.6340277777777777 | 169.156 |
| 0.6347222222222222 | 155.509 |
| 0.6354166666666666 | 141.884 |
| 0.6361111111111112 | 119.235 |
| 0.6368055555555555 | 123.758 |
| 0.6375000000000001 | 137.347 |
| 0.6381944444444444 | 150.964 |
| 0.638888888888889 | 182.82 |
| 0.6395833333333333 | 196.497 |
| 0.6402777777777778 | 205.62 |
| 0.6409722222222222 | 214.746 |
| 0.6416666666666667 | 305.898 |
| 0.642361111111111 | 364.728 |
| 0.6430555555555556 | 319.517 |
| 0.6437499999999999 | 493.475 |
| 0.6444444444444445 | 458.38 |
| 0.6451388888888888 | 977.508 |
| 0.6458333333333334 | 449.551 |
| 0.6465277777777778 | 658.909 |
| 0.6472222222222223 | 917.534 |
| 0.6479166666666667 | 860.676 |
| 0.6486111111111111 | 604.864 |
| 0.6493055555555556 | 337.639 |
| 0.65 | 719.877 |
| 0.6506944444444445 | 219.309 |
| 0.6513888888888889 | 169.156 |
| 0.6520833333333333 | 160.056 |
| 0.6527777777777778 | 141.884 |
| 0.6534722222222222 | 123.758 |
| 0.6541666666666667 | 96.682 |
| 0.6548611111111111 | 96.682 |
| 0.6555555555555556 | 105.69 |
| 0.65625 | 96.682 |
| 0.6569444444444444 | 87.692 |
| 0.6576388888888889 | 78.722 |
| 0.6583333333333333 | 74.246 |
| 0.6590277777777778 | 74.246 |
| 0.6597222222222222 | 83.205 |
| 0.6604166666666667 | 87.692 |
| 0.6611111111111111 | 87.692 |
| 0.6618055555555555 | 101.184 |
| 0.6625 | 92.184 |
| 0.6631944444444444 | 74.246 |
| 0.6638888888888889 | 74.246 |
| 0.6645833333333333 | 83.205 |
| 0.6652777777777777 | 92.184 |
| 0.6659722222222222 | 96.682 |
| 0.6666666666666666 | 105.69 |
| 0.6673611111111111 | 201.058 |
| 0.6680555555555556 | 137.347 |
| 0.6687500000000001 | 150.964 |
| 0.6694444444444444 | 169.156 |
| 0.6701388888888888 | 191.937 |
| 0.6708333333333334 | 219.309 |
| 0.6715277777777778 | 233 |
| 0.6722222222222222 | 223.873 |
| 0.6729166666666666 | 201.058 |
| 0.6736111111111112 | 178.264 |
| 0.6743055555555556 | 164.605 |
| 0.6749999999999999 | 150.964 |
| 0.6756944444444444 | 137.347 |
| 0.6763888888888889 | 146.423 |
| 0.6770833333333334 | 164.605 |
| 0.6777777777777777 | 155.509 |
| 0.6784722222222223 | 155.509 |
| 0.6791666666666667 | 155.509 |
| 0.6798611111111111 | 155.509 |
| 0.6805555555555555 | 155.509 |
| 0.68125 | 150.964 |
| 0.6819444444444445 | 137.347 |
| 0.6826388888888889 | 128.284 |
| 0.6833333333333332 | 314.98 |
| 0.6840277777777778 | 440.702 |
| 0.6847222222222222 | 333.113 |
| 0.6854166666666667 | 173.709 |
| 0.686111111111111 | 155.509 |
| 0.6868055555555556 | 74.246 |
| 0.6875 | 65.31 |
| 0.6881944444444444 | 60.85 |
| 0.688888888888889 | 60.85 |
| 0.6895833333333333 | 60.85 |
| 0.6902777777777778 | 65.31 |
| 0.6909722222222222 | 60.85 |
| 0.6916666666666668 | 60.85 |
| 0.6923611111111111 | 56.398 |
| 0.6930555555555555 | 51.951 |
| 0.69375 | 47.511 |
| 0.6944444444444445 | 43.079 |
| 0.6951388888888889 | 43.079 |
| 0.6958333333333333 | 43.079 |
| 0.6965277777777777 | 38.653 |
| 0.6972222222222223 | 38.653 |
| 0.6979166666666666 | 38.653 |
| 0.6986111111111111 | 38.653 |
| 0.6993055555555556 | 34.234 |
| 0.7000000000000001 | 34.234 |
| 0.7006944444444444 | 29.823 |
| 0.7013888888888888 | 29.823 |
| 0.7020833333333334 | 29.823 |
| 0.7027777777777778 | 25.419 |
| 0.7034722222222222 | 25.419 |
| 0.7041666666666666 | 25.419 |
| 0.7048611111111112 | 25.419 |
| 0.7055555555555556 | 21.024 |
| 0.7062499999999999 | 21.024 |
| 0.7069444444444444 | 21.024 |
| 0.7076388888888889 | 16.636 |
| 0.7083333333333334 | 16.636 |
| 0.7090277777777777 | 16.636 |
| 0.7097222222222223 | 12.257 |
| 0.7104166666666667 | 12.257 |
| 0.7111111111111111 | 12.257 |
| 0.7118055555555555 | 7.887 |
| 0.7125 | 7.887 |
| 0.7131944444444445 | 7.887 |
| 0.7138888888888889 | 7.887 |
| 0.7145833333333332 | 7.887 |
| 0.7152777777777778 | 3.525 |
| 0.7159722222222222 | 3.525 |
| 0.7166666666666667 | 3.525 |
| 0.717361111111111 | 3.525 |
| 0.7180555555555556 | 3.525 |
| 0.71875 | 3.525 |
| 0.7194444444444444 | 3.525 |
| 0.720138888888889 | 3.525 |
| 0.7208333333333333 | 3.525 |
| 0.7215277777777778 | 3.525 |
| 0.7222222222222222 | 3.525 |
| 0.7229166666666668 | 3.525 |
| 0.7236111111111111 | 3.525 |
| 0.7243055555555555 | 0 |
| 0.725 | 0 |
| 0.7256944444444445 | 0 |
| 0.7263888888888889 | 0 |
| 0.7270833333333333 | 0 |
| 0.7277777777777777 | 0 |
| 0.7284722222222223 | 0 |
| 0.7291666666666666 | 0 |
| 0.7298611111111111 | 0 |
| 0.7305555555555556 | 0 |
| 0.7312500000000001 | 0 |
| 0.7319444444444444 | 0 |
| 0.7326388888888888 | 0 |
| 0.7333333333333334 | 0 |
| 0.7340277777777778 | 0 |
| 0.7347222222222222 | 0 |
| 0.7354166666666666 | 0 |
| 0.7361111111111112 | 0 |
| 0.7368055555555556 | 0 |
| 0.7374999999999999 | 0 |
| 0.7381944444444444 | 0 |
| 0.7388888888888889 | 0 |
| 0.7395833333333334 | 0 |
| 0.7402777777777777 | 0 |
| 0.7409722222222223 | 0 |
| 0.7416666666666667 | 0 |
| 0.7423611111111111 | 0 |
| 0.7430555555555555 | 0 |
| 0.74375 | 0 |
| 0.7444444444444445 | 0 |
| 0.7451388888888889 | 0 |
| 0.7458333333333332 | 0 |
| 0.7465277777777778 | 0 |
| 0.7472222222222222 | 0 |
| 0.7479166666666667 | 0 |
| 0.748611111111111 | 0 |
| 0.7493055555555556 | 0 |
| 0.75 | 0 |
| 0.7506944444444444 | 0 |
| 0.751388888888889 | 0 |
| 0.7520833333333333 | 0 |
| 0.7527777777777778 | 0 |
| 0.7534722222222222 | 0 |
| 0.7541666666666668 | 0 |
| 0.7548611111111111 | 0 |
| 0.7555555555555555 | 0 |
| 0.75625 | 0 |
| 0.7569444444444445 | 0 |
| 0.7576388888888889 | 0 |
| 0.7583333333333333 | 0 |
| 0.7590277777777777 | 0 |
| 0.7597222222222223 | 0 |
| 0.7604166666666666 | 0 |
| 0.7611111111111111 | 0 |
| 0.7618055555555556 | 0 |
| 0.7625000000000001 | 0 |
| 0.7631944444444444 | 0 |
| 0.7638888888888888 | 0 |
| 0.7645833333333334 | 0 |
| 0.7652777777777778 | 0 |
| 0.7659722222222222 | 0 |
| 0.7666666666666666 | 0 |
| 0.7673611111111112 | 0 |
| 0.7680555555555556 | 0 |
| 0.7687499999999999 | 0 |
| 0.7694444444444444 | 0 |
| 0.7701388888888889 | 0 |
| 0.7708333333333334 | 0 |
| 0.7715277777777777 | 0 |
| 0.7722222222222223 | 0 |
| 0.7729166666666667 | 0 |
| 0.7736111111111111 | 0 |
| 0.7743055555555555 | 0 |
| 0.775 | 0 |
| 0.7756944444444445 | 0 |
| 0.7763888888888889 | 0 |
| 0.7770833333333332 | 0 |
| 0.7777777777777778 | 0 |
| 0.7784722222222222 | 0 |
| 0.7791666666666667 | 0 |
| 0.779861111111111 | 0 |
| 0.7805555555555556 | 0 |
| 0.78125 | 0 |
| 0.7819444444444444 | 0 |
| 0.782638888888889 | 0 |
| 0.7833333333333333 | 0 |
| 0.7840277777777778 | 0 |
| 0.7847222222222222 | 0 |
| 0.7854166666666668 | 0 |
| 0.7861111111111111 | 0 |
| 0.7868055555555555 | 0 |
| 0.7875 | 0 |
| 0.7881944444444445 | 0 |
| 0.7888888888888889 | 0 |
| 0.7895833333333333 | 0 |
| 0.7902777777777777 | 0 |
| 0.7909722222222223 | 0 |
| 0.7916666666666666 | 0 |
| 0.7923611111111111 | 0 |
| 0.7930555555555556 | 0 |
| 0.7937500000000001 | 0 |
| 0.7944444444444444 | 0 |
| 0.7951388888888888 | 0 |
| 0.7958333333333334 | 0 |
| 0.7965277777777778 | 0 |
| 0.7972222222222222 | 0 |
| 0.7979166666666666 | 0 |
| 0.7986111111111112 | 0 |
| 0.7993055555555556 | 0 |
| 0.7999999999999999 | 0 |
| 0.8006944444444444 | 0 |
| 0.8013888888888889 | 0 |
| 0.8020833333333334 | 0 |
| 0.8027777777777777 | 0 |
| 0.8034722222222223 | 0 |
| 0.8041666666666667 | 0 |
| 0.8048611111111111 | 0 |
| 0.8055555555555555 | 0 |
| 0.80625 | 0 |
| 0.8069444444444445 | 0 |
| 0.8076388888888889 | 0 |
| 0.8083333333333332 | 0 |
| 0.8090277777777778 | 0 |
| 0.8097222222222222 | 0 |
| 0.8104166666666667 | 0 |
| 0.811111111111111 | 0 |
| 0.8118055555555556 | 0 |
| 0.8125 | 0 |
| 0.8131944444444444 | 0 |
| 0.813888888888889 | 0 |
| 0.8145833333333333 | 0 |
| 0.8152777777777778 | 0 |
| 0.8159722222222222 | 0 |
| 0.8166666666666668 | 0 |
| 0.8173611111111111 | 0 |
| 0.8180555555555555 | 0 |
| 0.81875 | 0 |
| 0.8194444444444445 | 0 |
| 0.8201388888888889 | 0 |
| 0.8208333333333333 | 0 |
| 0.8215277777777777 | 0 |
| 0.8222222222222223 | 0 |
| 0.8229166666666666 | 0 |
| 0.8236111111111111 | 0 |
| 0.8243055555555556 | 0 |
| 0.8250000000000001 | 0 |
| 0.8256944444444444 | 0 |
| 0.8263888888888888 | 0 |
| 0.8270833333333334 | 0 |
| 0.8277777777777778 | 0 |
| 0.8284722222222222 | 0 |
| 0.8291666666666666 | 0 |
| 0.8298611111111112 | 0 |
| 0.8305555555555556 | 0 |
| 0.8312499999999999 | 0 |
| 0.8319444444444444 | 0 |
| 0.8326388888888889 | 0 |
| 0.8333333333333334 | 0 |
| 0.8340277777777777 | 0 |
| 0.8347222222222223 | 0 |
| 0.8354166666666667 | 0 |
| 0.8361111111111111 | 0 |
| 0.8368055555555555 | 0 |
| 0.8375 | 0 |
| 0.8381944444444445 | 0 |
| 0.8388888888888889 | 0 |
| 0.8395833333333332 | 0 |
| 0.8402777777777778 | 0 |
| 0.8409722222222222 | 0 |
| 0.8416666666666667 | 0 |
| 0.842361111111111 | 0 |
| 0.8430555555555556 | 0 |
| 0.84375 | 0 |
| 0.8444444444444444 | 0 |
| 0.845138888888889 | 0 |
| 0.8458333333333333 | 0 |
| 0.8465277777777778 | 0 |
| 0.8472222222222222 | 0 |
| 0.8479166666666668 | 0 |
| 0.8486111111111111 | 0 |
| 0.8493055555555555 | 0 |
| 0.85 | 0 |
| 0.8506944444444445 | 0 |
| 0.8513888888888889 | 0 |
| 0.8520833333333333 | 0 |
| 0.8527777777777777 | 0 |
| 0.8534722222222223 | 0 |
| 0.8541666666666666 | 0 |
| 0.8548611111111111 | 0 |
| 0.8555555555555556 | 0 |
| 0.8562500000000001 | 0 |
| 0.8569444444444444 | 0 |
| 0.8576388888888888 | 0 |
| 0.8583333333333334 | 0 |
| 0.8590277777777778 | 0 |
| 0.8597222222222222 | 0 |
| 0.8604166666666666 | 0 |
| 0.8611111111111112 | 0 |
| 0.8618055555555556 | 0 |
| 0.8624999999999999 | 0 |
| 0.8631944444444444 | 0 |
| 0.8638888888888889 | 0 |
| 0.8645833333333334 | 0 |
| 0.8652777777777777 | 0 |
| 0.8659722222222223 | 0 |
| 0.8666666666666667 | 0 |
| 0.8673611111111111 | 0 |
| 0.8680555555555555 | 0 |
| 0.86875 | 0 |
| 0.8694444444444445 | 0 |
| 0.8701388888888889 | 0 |
| 0.8708333333333332 | 0 |
| 0.8715277777777778 | 0 |
| 0.8722222222222222 | 0 |
| 0.8729166666666667 | 0 |
| 0.873611111111111 | 0 |
| 0.8743055555555556 | 0 |
| 0.875 | 0 |
| 0.8756944444444444 | 0 |
| 0.876388888888889 | 0 |
| 0.8770833333333333 | 0 |
| 0.8777777777777778 | 0 |
| 0.8784722222222222 | 0 |
| 0.8791666666666668 | 0 |
| 0.8798611111111111 | 0 |
| 0.8805555555555555 | 0 |
| 0.88125 | 0 |
| 0.8819444444444445 | 0 |
| 0.8826388888888889 | 0 |
| 0.8833333333333333 | 0 |
| 0.8840277777777777 | 0 |
| 0.8847222222222223 | 0 |
| 0.8854166666666666 | 0 |
| 0.8861111111111111 | 0 |
| 0.8868055555555556 | 0 |
| 0.8875000000000001 | 0 |
| 0.8881944444444444 | 0 |
| 0.8888888888888888 | 0 |
| 0.8895833333333334 | 0 |
| 0.8902777777777778 | 0 |
| 0.8909722222222222 | 0 |
| 0.8916666666666666 | 0 |
| 0.8923611111111112 | 0 |
| 0.8930555555555556 | 0 |
| 0.8937499999999999 | 0 |
| 0.8944444444444444 | 0 |
| 0.8951388888888889 | 0 |
| 0.8958333333333334 | 0 |
| 0.8965277777777777 | 0 |
| 0.8972222222222223 | 0 |
| 0.8979166666666667 | 0 |
| 0.8986111111111111 | 0 |
| 0.8993055555555555 | 0 |
| 0.9 | 0 |
| 0.9006944444444445 | 0 |
| 0.9013888888888889 | 0 |
| 0.9020833333333332 | 0 |
| 0.9027777777777778 | 0 |
| 0.9034722222222222 | 0 |
| 0.9041666666666667 | 0 |
| 0.904861111111111 | 0 |
| 0.9055555555555556 | 0 |
| 0.90625 | 0 |
| 0.9069444444444444 | 0 |
| 0.907638888888889 | 0 |
| 0.9083333333333333 | 0 |
| 0.9090277777777778 | 0 |
| 0.9097222222222222 | 0 |
| 0.9104166666666668 | 0 |
| 0.9111111111111111 | 0 |
| 0.9118055555555555 | 0 |
| 0.9125 | 0 |
| 0.9131944444444445 | 0 |
| 0.9138888888888889 | 0 |
| 0.9145833333333333 | 0 |
| 0.9152777777777777 | 0 |
| 0.9159722222222223 | 0 |
| 0.9166666666666666 | 0 |
| 0.9173611111111111 | 0 |
| 0.9180555555555556 | 0 |
| 0.9187500000000001 | 0 |
| 0.9194444444444444 | 0 |
| 0.9201388888888888 | 0 |
| 0.9208333333333334 | 0 |
| 0.9215277777777778 | 0 |
| 0.9222222222222222 | 0 |
| 0.9229166666666666 | 0 |
| 0.9236111111111112 | 0 |
| 0.9243055555555556 | 0 |
| 0.9249999999999999 | 0 |
| 0.9256944444444444 | 0 |
| 0.9263888888888889 | 0 |
| 0.9270833333333334 | 0 |
| 0.9277777777777777 | 0 |
| 0.9284722222222223 | 0 |
| 0.9291666666666667 | 0 |
| 0.9298611111111111 | 0 |
| 0.9305555555555555 | 0 |
| 0.93125 | 0 |
| 0.9319444444444445 | 0 |
| 0.9326388888888889 | 0 |
| 0.9333333333333332 | 0 |
| 0.9340277777777778 | 0 |
| 0.9347222222222222 | 0 |
| 0.9354166666666667 | 0 |
| 0.936111111111111 | 0 |
| 0.9368055555555556 | 0 |
| 0.9375 | 0 |
| 0.9381944444444444 | 0 |
| 0.938888888888889 | 0 |
| 0.9395833333333333 | 0 |
| 0.9402777777777778 | 0 |
| 0.9409722222222222 | 0 |
| 0.9416666666666668 | 0 |
| 0.9423611111111111 | 0 |
| 0.9430555555555555 | 0 |
| 0.94375 | 0 |
| 0.9444444444444445 | 0 |
| 0.9451388888888889 | 0 |
| 0.9458333333333333 | 0 |
| 0.9465277777777777 | 0 |
| 0.9472222222222223 | 0 |
| 0.9479166666666666 | 0 |
| 0.9486111111111111 | 0 |
| 0.9493055555555556 | 0 |
| 0.9500000000000001 | 0 |
| 0.9506944444444444 | 0 |
| 0.9513888888888888 | 0 |
| 0.9520833333333334 | 0 |
| 0.9527777777777778 | 0 |
| 0.9534722222222222 | 0 |
| 0.9541666666666666 | 0 |
| 0.9548611111111112 | 0 |
| 0.9555555555555556 | 0 |
| 0.9562499999999999 | 0 |
| 0.9569444444444444 | 0 |
| 0.9576388888888889 | 0 |
| 0.9583333333333334 | 0 |
| 0.9590277777777777 | 0 |
| 0.9597222222222223 | 0 |
| 0.9604166666666667 | 0 |
| 0.9611111111111111 | 0 |
| 0.9618055555555555 | 0 |
| 0.9625 | 0 |
| 0.9631944444444445 | 0 |
| 0.9638888888888889 | 0 |
| 0.9645833333333332 | 0 |
| 0.9652777777777778 | 0 |
| 0.9659722222222222 | 0 |
| 0.9666666666666667 | 0 |
| 0.967361111111111 | 0 |
| 0.9680555555555556 | 0 |
| 0.96875 | 0 |
| 0.9694444444444444 | 0 |
| 0.970138888888889 | 0 |
| 0.9708333333333333 | 0 |
| 0.9715277777777778 | 0 |
| 0.9722222222222222 | 0 |
| 0.9729166666666668 | 0 |
| 0.9736111111111111 | 0 |
| 0.9743055555555555 | 0 |
| 0.975 | 0 |
| 0.9756944444444445 | 0 |
| 0.9763888888888889 | 0 |
| 0.9770833333333333 | 0 |
| 0.9777777777777777 | 0 |
| 0.9784722222222223 | 0 |
| 0.9791666666666666 | 0 |
| 0.9798611111111111 | 0 |
| 0.9805555555555556 | 0 |
| 0.9812500000000001 | 0 |
| 0.9819444444444444 | 0 |
| 0.9826388888888888 | 0 |
| 0.9833333333333334 | 0 |
| 0.9840277777777778 | 0 |
| 0.9847222222222222 | 0 |
| 0.9854166666666666 | 0 |
| 0.9861111111111112 | 0 |
| 0.9868055555555556 | 0 |
| 0.9874999999999999 | 0 |
| 0.9881944444444444 | 0 |
| 0.9888888888888889 | 0 |
| 0.9895833333333334 | 0 |
| 0.9902777777777777 | 0 |
| 0.9909722222222223 | 0 |
| 0.9916666666666667 | 0 |
| 0.9923611111111111 | 0 |
| 0.9930555555555555 | 0 |
| 0.99375 | 0 |
| 0.9944444444444445 | 0 |
| 0.9951388888888889 | 0 |
| 0.9958333333333332 | 0 |
| 0.9965277777777778 | 0 |
| 0.9972222222222222 | 0 |
| 0.9979166666666667 | 0 |
| 0.998611111111111 | 0 |
| 0.9993055555555556 | 0 |